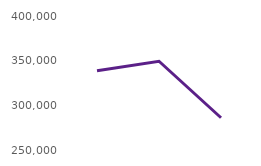
| Category | Users accessing the website |
|---|---|
| Oct23 | 338597 |
| Nov23 | 349382 |
| Dec23 | 286118 |